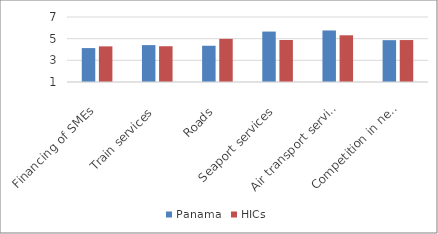
| Category | Panama | HICs |
|---|---|---|
| Financing of SMEs | 4.131 | 4.29 |
| Train services | 4.404 | 4.302 |
| Roads | 4.346 | 4.982 |
| Seaport services | 5.655 | 4.877 |
| Air transport services | 5.757 | 5.311 |
| Competition in network services | 4.861 | 4.872 |